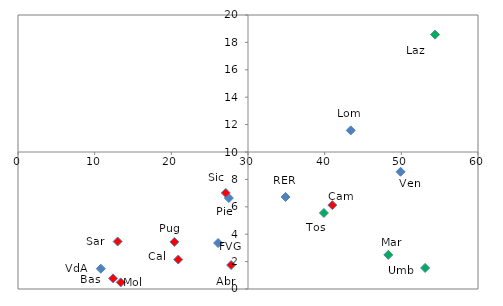
| Category | Series 0 |
|---|---|
| 27.5 | 6.637 |
| 10.8 | 1.48 |
| 43.4 | 11.575 |
| 49.9 | 8.557 |
| 26.1 | 3.356 |
| 121.4 | 3.042 |
| 34.9 | 6.718 |
| 39.9 | 5.551 |
| 53.1 | 1.539 |
| 48.3 | 2.491 |
| 54.4 | 18.566 |
| 27.8 | 1.748 |
| 13.4 | 0.483 |
| 41.0 | 6.125 |
| 20.4 | 3.436 |
| 12.4 | 0.777 |
| 20.9 | 2.151 |
| 27.1 | 7.008 |
| 13.0 | 3.466 |